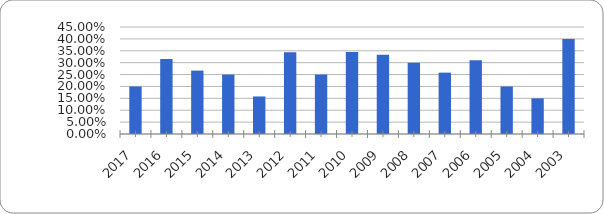
| Category | Series 0 |
|---|---|
| 2017.0 | 0.2 |
| 2016.0 | 0.316 |
| 2015.0 | 0.267 |
| 2014.0 | 0.25 |
| 2013.0 | 0.158 |
| 2012.0 | 0.344 |
| 2011.0 | 0.25 |
| 2010.0 | 0.345 |
| 2009.0 | 0.333 |
| 2008.0 | 0.3 |
| 2007.0 | 0.258 |
| 2006.0 | 0.31 |
| 2005.0 | 0.2 |
| 2004.0 | 0.15 |
| 2003.0 | 0.4 |